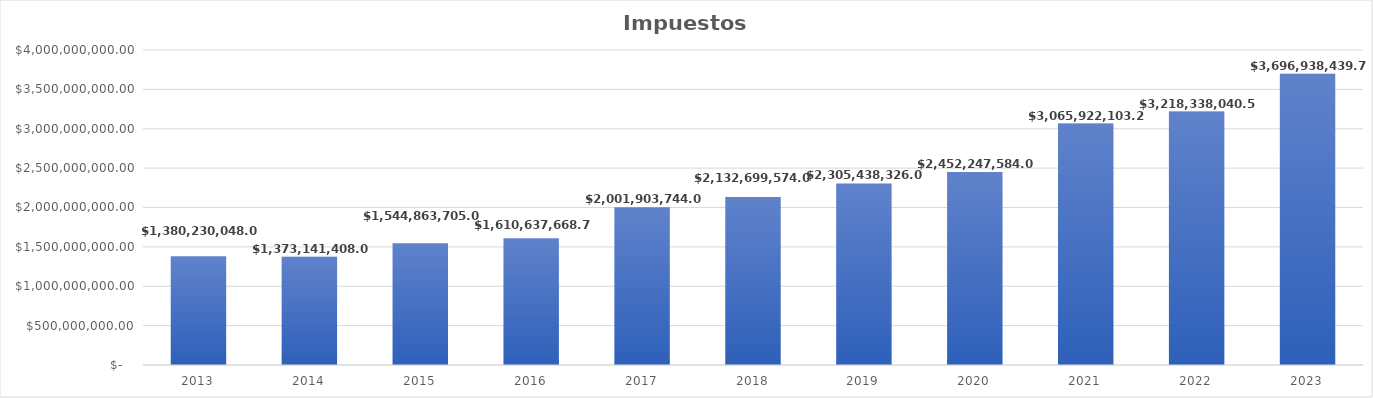
| Category | Impuestos (total) |
|---|---|
| 2013.0 | 1380230048 |
| 2014.0 | 1373141408 |
| 2015.0 | 1544863705 |
| 2016.0 | 1610637668.72 |
| 2017.0 | 2001903744 |
| 2018.0 | 2132699574 |
| 2019.0 | 2305438326 |
| 2020.0 | 2452247584 |
| 2021.0 | 3065922103.24 |
| 2022.0 | 3218338040.5 |
| 2023.0 | 3696938439.7 |